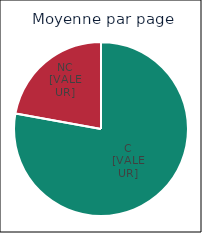
| Category | Series 0 |
|---|---|
| 0 | 0.779 |
| 1 | 0.221 |